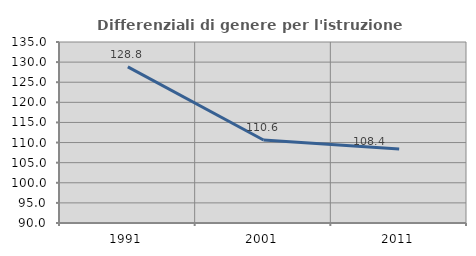
| Category | Differenziali di genere per l'istruzione superiore |
|---|---|
| 1991.0 | 128.822 |
| 2001.0 | 110.639 |
| 2011.0 | 108.416 |